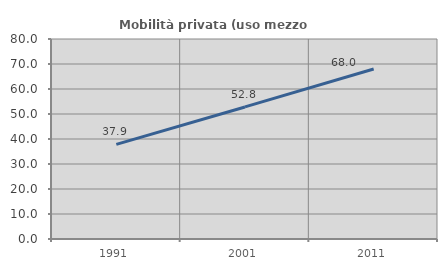
| Category | Mobilità privata (uso mezzo privato) |
|---|---|
| 1991.0 | 37.854 |
| 2001.0 | 52.826 |
| 2011.0 | 67.988 |